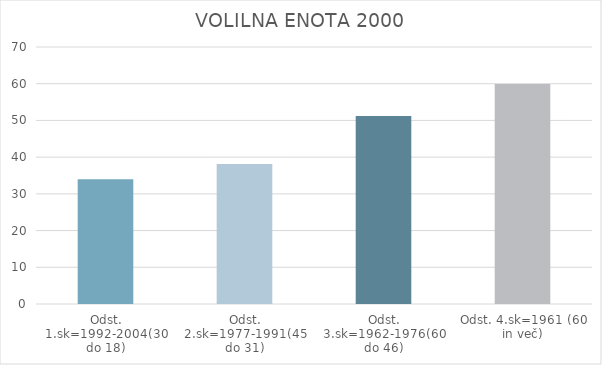
| Category | Series 0 |
|---|---|
| Odst. 1.sk=1992-2004(30 do 18) | 33.98 |
| Odst. 2.sk=1977-1991(45 do 31) | 38.16 |
| Odst. 3.sk=1962-1976(60 do 46) | 51.21 |
| Odst. 4.sk=1961 (60 in več) | 59.93 |